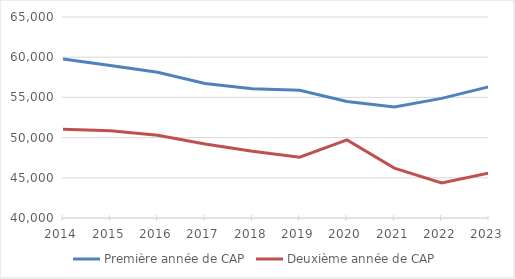
| Category | Première année de CAP | Deuxième année de CAP |
|---|---|---|
| 2014.0 | 59783 | 51039 |
| 2015.0 | 58961 | 50858 |
| 2016.0 | 58116 | 50303 |
| 2017.0 | 56732 | 49208 |
| 2018.0 | 56083 | 48304 |
| 2019.0 | 55898 | 47559 |
| 2020.0 | 54482 | 49715 |
| 2021.0 | 53822 | 46205 |
| 2022.0 | 54879 | 44361 |
| 2023.0 | 56334 | 45591 |